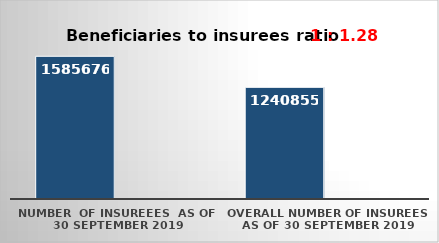
| Category | Series 0 | Series 1 |
|---|---|---|
| NUMBER  of insureees  as of  30 September 2019 | 1585676 |  |
| OVERALL number of insurees as of 30 September 2019 | 1240855 |  |